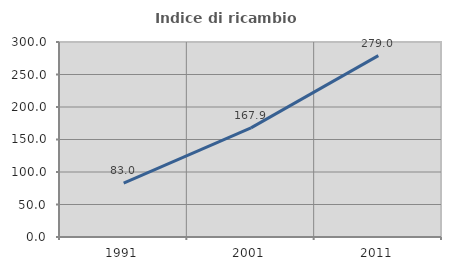
| Category | Indice di ricambio occupazionale  |
|---|---|
| 1991.0 | 83 |
| 2001.0 | 167.925 |
| 2011.0 | 279.012 |